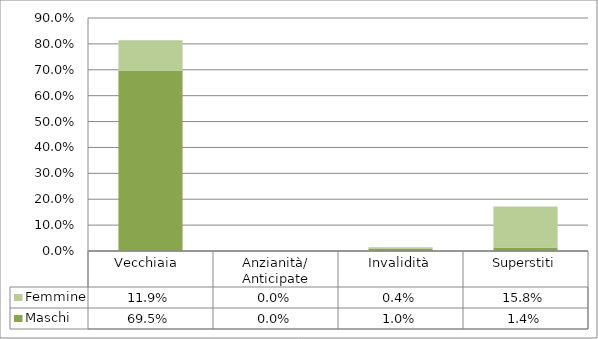
| Category | Maschi | Femmine |
|---|---|---|
| Vecchiaia  | 0.695 | 0.119 |
| Anzianità/ Anticipate | 0 | 0 |
| Invalidità | 0.01 | 0.004 |
| Superstiti | 0.014 | 0.158 |